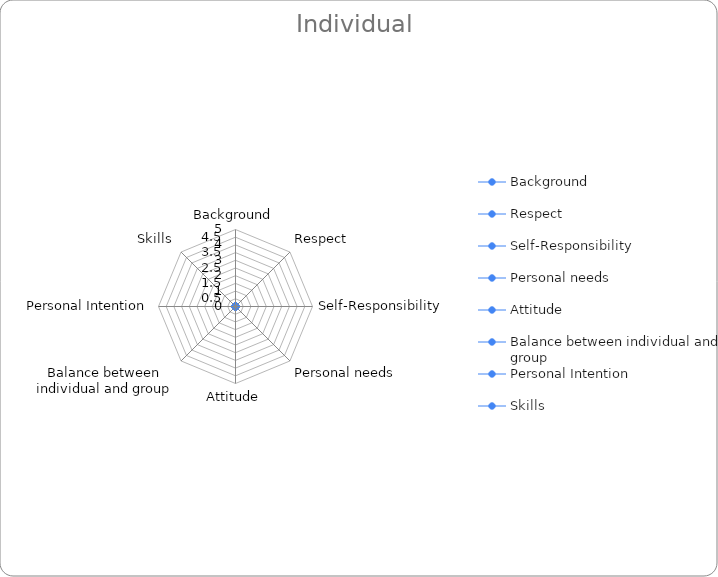
| Category | Series 0 |
|---|---|
| Background | 0 |
| Respect | 0 |
| Self-Responsibility | 0 |
| Personal needs | 0 |
| Attitude | 0 |
| Balance between individual and group | 0 |
| Personal Intention | 0 |
| Skills | 0 |